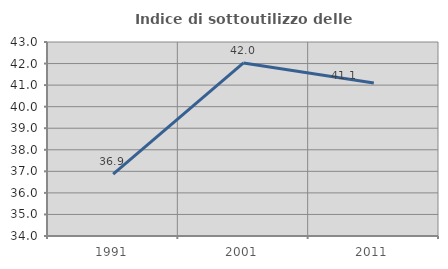
| Category | Indice di sottoutilizzo delle abitazioni  |
|---|---|
| 1991.0 | 36.867 |
| 2001.0 | 42.029 |
| 2011.0 | 41.1 |